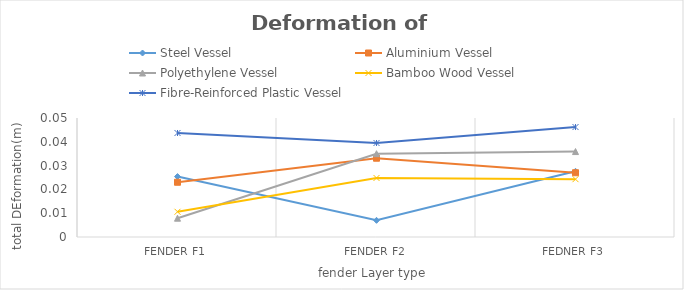
| Category | Steel Vessel  | Aluminium Vessel | Polyethylene Vessel | Bamboo Wood Vessel | Fibre-Reinforced Plastic Vessel |
|---|---|---|---|---|---|
| Fender F1 | 0.025 | 0.023 | 0.008 | 0.011 | 0.044 |
| Fender F2 | 0.007 | 0.033 | 0.035 | 0.025 | 0.04 |
| Fedner F3 | 0.028 | 0.027 | 0.036 | 0.024 | 0.046 |